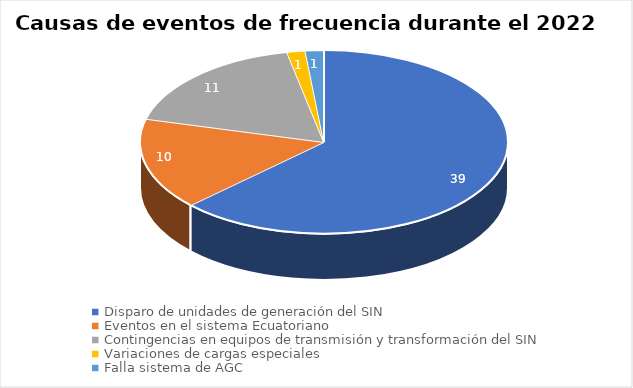
| Category | Series 0 |
|---|---|
| Disparo de unidades de generación del SIN | 39 |
| Eventos en el sistema Ecuatoriano | 10 |
| Contingencias en equipos de transmisión y transformación del SIN | 11 |
| Variaciones de cargas especiales | 1 |
| Falla sistema de AGC | 1 |